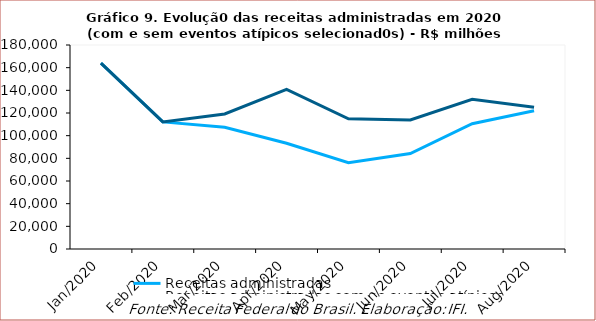
| Category | Receitas administradas | Receitas administradas sem os eventos atípicos |
|---|---|---|
| 2020-01-01 | 163948 | 163948 |
| 2020-02-01 | 112141 | 112141 |
| 2020-03-01 | 107390 | 119114 |
| 2020-04-01 | 93332 | 140911 |
| 2020-05-01 | 76139 | 114931 |
| 2020-06-01 | 84267 | 113848 |
| 2020-07-01 | 110540 | 132108 |
| 2020-08-01 | 121993 | 125146 |